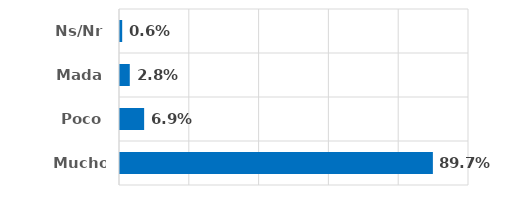
| Category | Series 0 |
|---|---|
| Mucho | 0.897 |
| Poco | 0.069 |
| Mada | 0.028 |
| Ns/Nr | 0.006 |